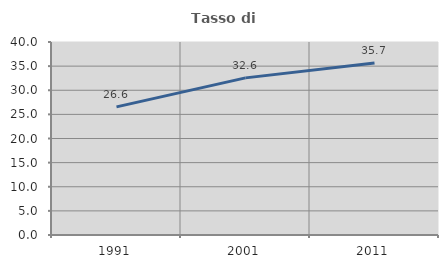
| Category | Tasso di occupazione   |
|---|---|
| 1991.0 | 26.554 |
| 2001.0 | 32.563 |
| 2011.0 | 35.667 |